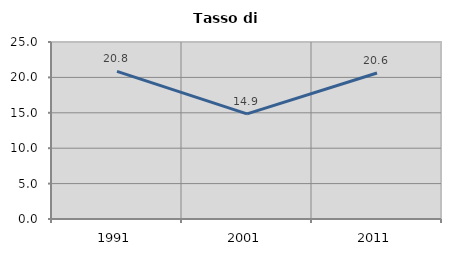
| Category | Tasso di disoccupazione   |
|---|---|
| 1991.0 | 20.843 |
| 2001.0 | 14.856 |
| 2011.0 | 20.622 |